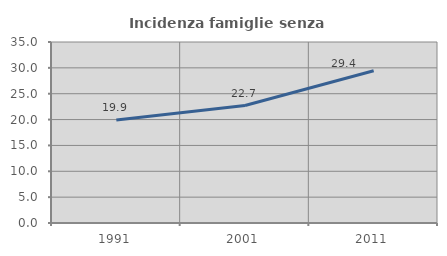
| Category | Incidenza famiglie senza nuclei |
|---|---|
| 1991.0 | 19.93 |
| 2001.0 | 22.708 |
| 2011.0 | 29.43 |